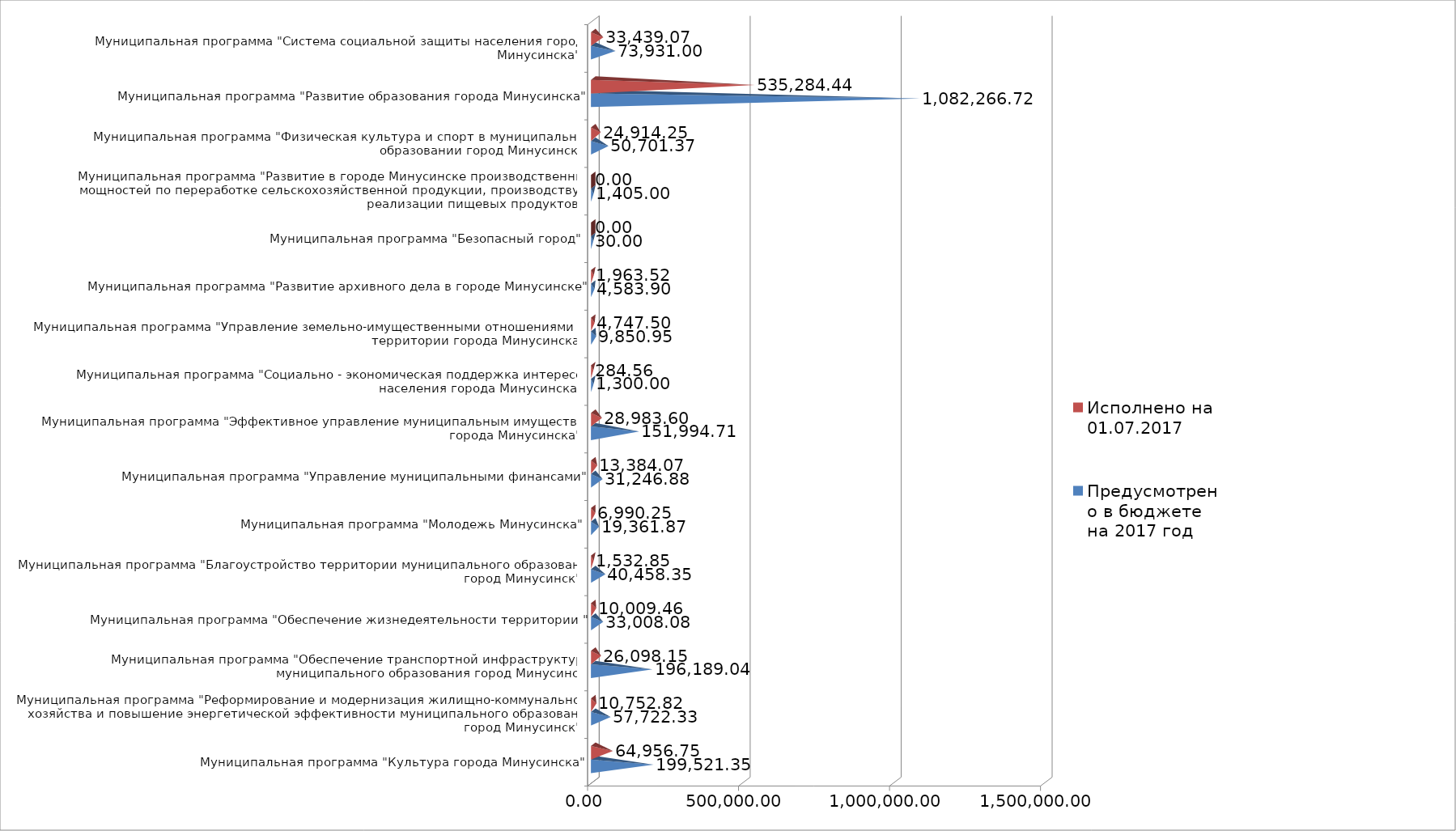
| Category | Предусмотрено в бюджете на 2017 год | Исполнено на 01.07.2017 |
|---|---|---|
| Муниципальная программа "Культура города Минусинска" | 199521.35 | 64956.75 |
| Муниципальная программа "Реформирование и модернизация жилищно-коммунального хозяйства и повышение энергетической эффективности муниципального образования город Минусинск" | 57722.33 | 10752.82 |
| Муниципальная программа "Обеспечение транспортной инфраструктуры муниципального образования город Минусинск | 196189.04 | 26098.15 |
| Муниципальная программа "Обеспечение жизнедеятельности территории " | 33008.08 | 10009.46 |
| Муниципальная программа "Благоустройство территории муниципального образования город Минусинск" | 40458.35 | 1532.85 |
| Муниципальная программа "Молодежь Минусинска" | 19361.87 | 6990.25 |
| Муниципальная программа "Управление муниципальными финансами" | 31246.88 | 13384.07 |
| Муниципальная программа "Эффективное управление муниципальным имуществом города Минусинска" | 151994.71 | 28983.6 |
| Муниципальная программа "Социально - экономическая поддержка интересов населения города Минусинска" | 1300 | 284.56 |
| Муниципальная программа "Управление земельно-имущественными отношениями на территории города Минусинска" | 9850.95 | 4747.5 |
| Муниципальная программа "Развитие архивного дела в городе Минусинске" | 4583.9 | 1963.52 |
| Муниципальная программа "Безопасный город" | 30 | 0 |
| Муниципальная программа "Развитие в городе Минусинске производственных мощностей по переработке сельскохозяйственной продукции, производству и реализации пищевых продуктов" | 1405 | 0 |
| Муниципальная программа "Физическая культура и спорт в муниципальном образовании город Минусинск" | 50701.37 | 24914.25 |
| Муниципальная программа "Развитие образования города Минусинска" | 1082266.72 | 535284.44 |
| Муниципальная программа "Система социальной защиты населения города Минусинска" | 73931 | 33439.07 |